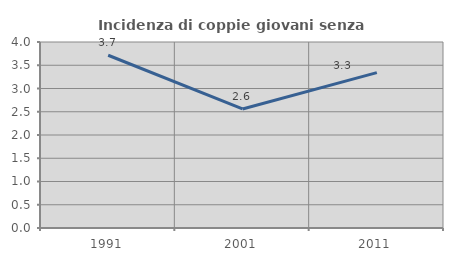
| Category | Incidenza di coppie giovani senza figli |
|---|---|
| 1991.0 | 3.715 |
| 2001.0 | 2.56 |
| 2011.0 | 3.342 |